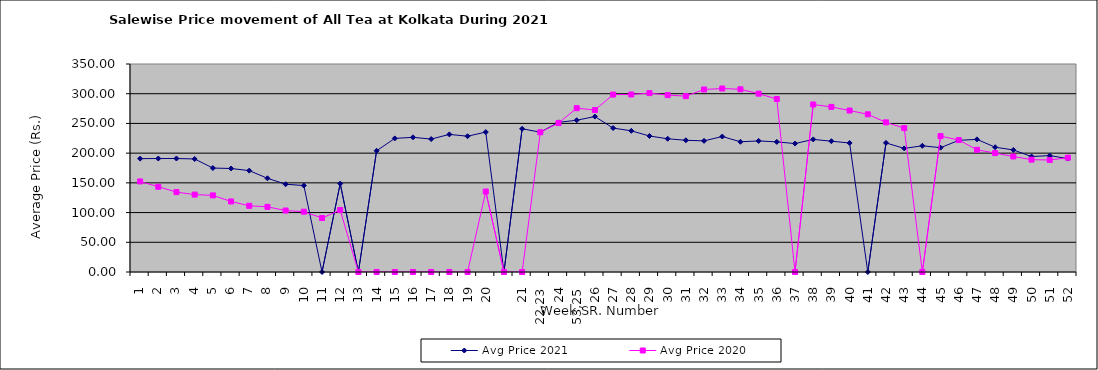
| Category | Avg Price 2021 | Avg Price 2020 |
|---|---|---|
| 1 | 190.742 | 152.398 |
| 2 | 190.947 | 143.462 |
| 3 | 190.964 | 134.407 |
| 4 | 190.212 | 130.252 |
| 5 | 174.907 | 128.935 |
| 6 | 174.162 | 118.723 |
| 7 | 170.575 | 111.381 |
| 8 | 157.713 | 109.644 |
| 9 | 147.729 | 103.446 |
| 10 | 145.495 | 101.488 |
| 11 | 0 | 90.818 |
| 12 | 148.743 | 104.291 |
| 13 | 0 | 0 |
| 14 | 203.979 | 0 |
| 15 | 224.793 | 0 |
| 16 | 226.627 | 0 |
| 17 | 223.693 | 0 |
| 18 | 231.555 | 0 |
| 19 | 228.456 | 0 |
| 20 | 235.473 | 135.395 |
|  | 0 | 0 |
| 21 | 240.962 | 0 |
| 22,23 | 235.302 | 235.111 |
| 24 | 251.801 | 250.543 |
| 53,25 | 255.381 | 275.634 |
| 26 | 261.6 | 272.593 |
| 27 | 242.187 | 298.542 |
| 28 | 237.551 | 298.71 |
| 29 | 228.853 | 301.042 |
| 30 | 224.17 | 297.63 |
| 31 | 221.636 | 295.894 |
| 32 | 220.657 | 307.116 |
| 33 | 227.988 | 308.755 |
| 34 | 219.094 | 307.424 |
| 35 | 220.589 | 300.099 |
| 36 | 218.919 | 291.038 |
| 37 | 216.135 | 0 |
| 38 | 223.106 | 281.869 |
| 39 | 220.099 | 277.78 |
| 40 | 217.035 | 271.713 |
| 41 | 0 | 265.334 |
| 42 | 217.224 | 251.785 |
| 43 | 207.974 | 242.117 |
| 44 | 212.386 | 0 |
| 45 | 209.183 | 228.663 |
| 46 | 221.526 | 222.004 |
| 47 | 223.214 | 205.667 |
| 48 | 209.994 | 200.056 |
| 49 | 205.409 | 194.395 |
| 50 | 194.322 | 189.033 |
| 51 | 195.829 | 188.478 |
| 52 | 190.91 | 192.387 |